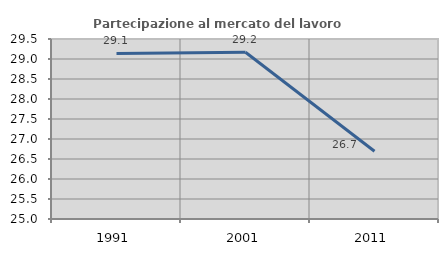
| Category | Partecipazione al mercato del lavoro  femminile |
|---|---|
| 1991.0 | 29.139 |
| 2001.0 | 29.17 |
| 2011.0 | 26.693 |